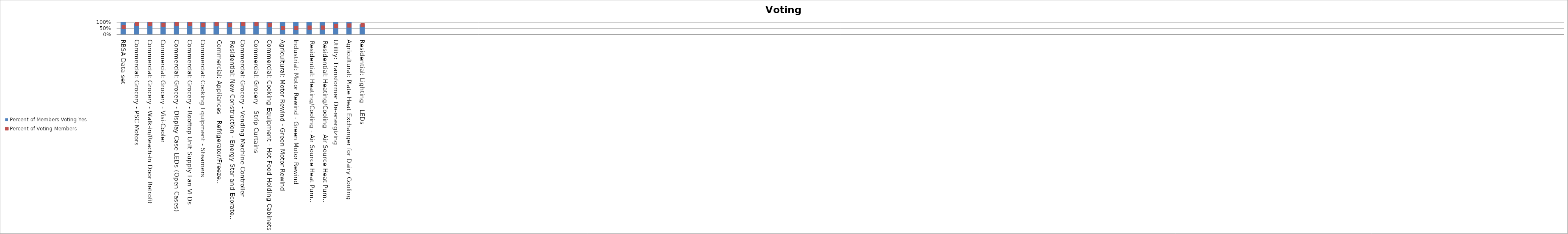
| Category | Percent of Members Voting Yes |
|---|---|
| RBSA Data set | 1 |
| Commercial: Grocery - PSC Motors | 0.923 |
| Commercial: Grocery - Walk-in/Reach-in Door Retrofit | 1 |
| Commercial: Grocery - Visi-Cooler | 1 |
| Commercial: Grocery - Display Case LEDs (Open Cases) | 1 |
| Commercial: Grocery - Rooftop Unit Supply Fan VFDs | 1 |
| Commercial: Cooking Equipment - Steamers | 1 |
| Commercial: Appliances - Refrigerator/Freezer Decommissioning | 1 |
| Residential: New Construction - Energy Star and Ecorated Homes MH | 1 |
| Commercial: Grocery - Vending Machine Controller | 1 |
| Commercial: Grocery - Strip Curtains | 1 |
| Commercial: Cooking Equipment - Hot Food Holding Cabinets | 1 |
| Agricultural: Motor Rewind - Green Motor Rewind | 1 |
| Industrial: Motor Rewind - Green Motor Rewind | 1 |
| Residential: Heating/Cooling - Air Source Heat Pump Upgrades SF (Existing Construction) | 1 |
| Residential: Heating/Cooling - Air Source Heat Pump Upgrades SF (New Construction) | 1 |
| Utility: Transformer De-energizing | 1 |
| Agricultural: Plate Heat Exchanger for Dairy Cooling | 1 |
| Residential: Lighting - LEDs | 0.826 |